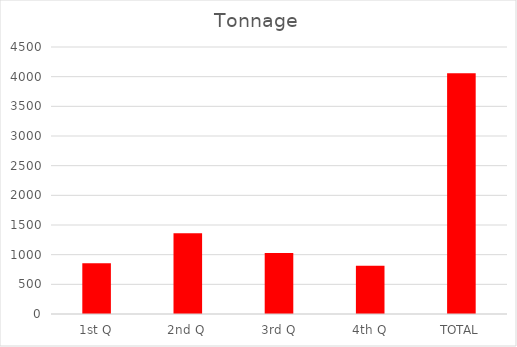
| Category | Series 0 |
|---|---|
| 1st Q | 853.9 |
| 2nd Q | 1361.13 |
| 3rd Q | 1029.34 |
| 4th Q | 813.99 |
| TOTAL | 4058.36 |